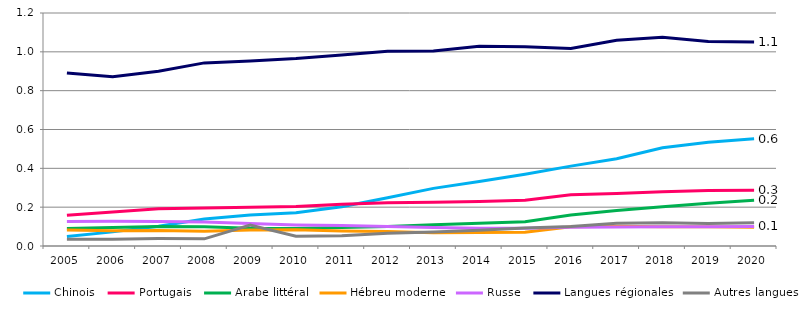
| Category | Chinois | Portugais | Arabe littéral | Hébreu moderne | Russe | Langues régionales | Autres langues |
|---|---|---|---|---|---|---|---|
| 2005 | 0.048 | 0.158 | 0.09 | 0.082 | 0.127 | 0.891 | 0.034 |
| 2006 | 0.073 | 0.175 | 0.096 | 0.078 | 0.127 | 0.871 | 0.035 |
| 2007 | 0.102 | 0.191 | 0.1 | 0.08 | 0.126 | 0.9 | 0.038 |
| 2008 | 0.139 | 0.195 | 0.099 | 0.077 | 0.124 | 0.943 | 0.037 |
| 2009 | 0.16 | 0.2 | 0.091 | 0.082 | 0.116 | 0.953 | 0.108 |
| 2010 | 0.172 | 0.204 | 0.09 | 0.084 | 0.108 | 0.966 | 0.05 |
| 2011 | 0.203 | 0.215 | 0.095 | 0.077 | 0.105 | 0.984 | 0.053 |
| 2012 | 0.249 | 0.223 | 0.1 | 0.074 | 0.101 | 1.004 | 0.066 |
| 2013 | 0.297 | 0.226 | 0.109 | 0.068 | 0.095 | 1.004 | 0.072 |
| 2014 | 0.332 | 0.23 | 0.118 | 0.07 | 0.092 | 1.028 | 0.082 |
| 2015 | 0.369 | 0.236 | 0.125 | 0.071 | 0.092 | 1.026 | 0.092 |
| 2016 | 0.411 | 0.264 | 0.16 | 0.1 | 0.096 | 1.017 | 0.101 |
| 2017 | 0.45 | 0.27 | 0.182 | 0.101 | 0.098 | 1.059 | 0.117 |
| 2018 | 0.506 | 0.279 | 0.203 | 0.099 | 0.1 | 1.075 | 0.119 |
| 2019 | 0.535 | 0.286 | 0.221 | 0.099 | 0.099 | 1.054 | 0.115 |
| 2020 | 0.552 | 0.287 | 0.236 | 0.097 | 0.101 | 1.051 | 0.12 |